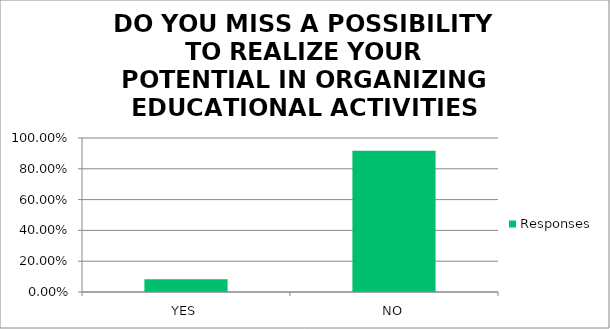
| Category | Responses |
|---|---|
| YES | 0.083 |
| NO | 0.917 |